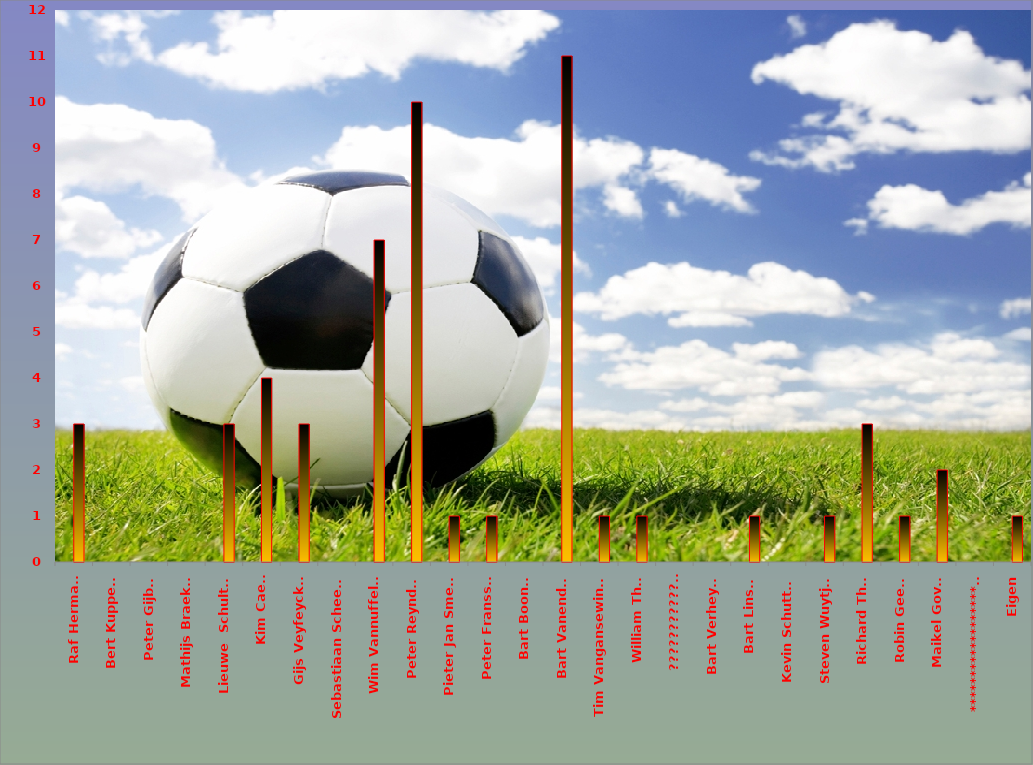
| Category | Series 0 | Series 1 |
|---|---|---|
| Raf Hermans |  | 3 |
| Bert Kuppens |  | 0 |
| Peter Gijbels |  | 0 |
| Mathijs Braeken |  | 0 |
| Lieuwe  Schultink |  | 3 |
| Kim Caels |  | 4 |
| Gijs Veyfeycken |  | 3 |
| Sebastiaan Scheelen |  | 0 |
| Wim Vannuffelen |  | 7 |
| Peter Reynders |  | 10 |
| Pieter Jan Smeets |  | 1 |
| Peter Franssen |  | 1 |
| Bart Boonen |  | 0 |
| Bart Vanendert |  | 11 |
| Tim Vangansewinkel |  | 1 |
| William Thijs |  | 1 |
| ????????????? |  | 0 |
| Bart Verheyen |  | 0 |
| Bart Linsen |  | 1 |
| Kevin Schutters |  | 0 |
| Steven Wuytjes |  | 1 |
| Richard Thijs |  | 3 |
| Robin Geerts |  | 1 |
| Maikel Goven |  | 2 |
| ******************** |  | 0 |
| Eigen |  | 1 |